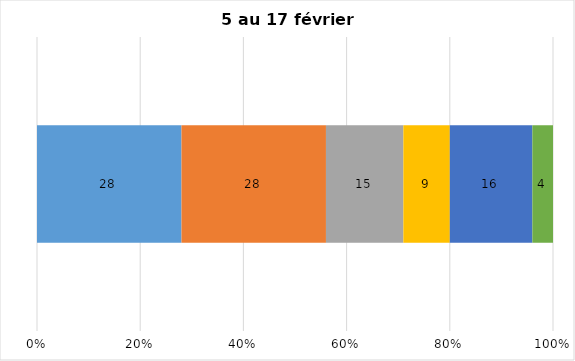
| Category | Plusieurs fois par jour | Une fois par jour | Quelques fois par semaine   | Une fois par semaine ou moins   |  Jamais   |  Je n’utilise pas les médias sociaux |
|---|---|---|---|---|---|---|
| 0 | 28 | 28 | 15 | 9 | 16 | 4 |